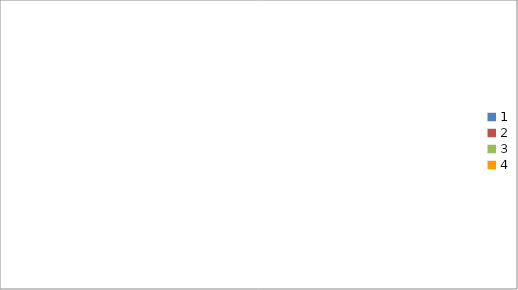
| Category | Series 0 |
|---|---|
| 0 | 3240 |
| 1 | 2780 |
| 2 | 760 |
| 3 | 3320 |